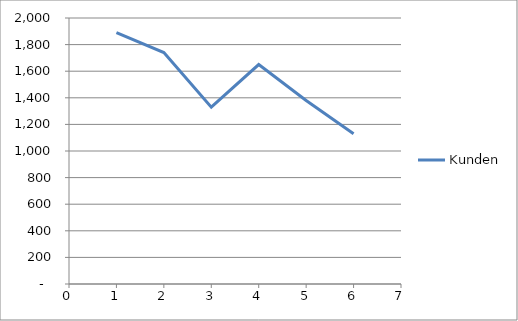
| Category |  Kunden  |
|---|---|
| 0 | 1890 |
| 1 | 1740 |
| 2 | 1330 |
| 3 | 1650 |
| 4 | 1380 |
| 5 | 1130 |